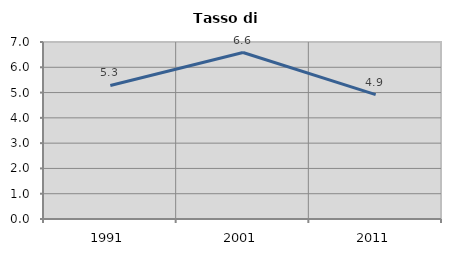
| Category | Tasso di disoccupazione   |
|---|---|
| 1991.0 | 5.281 |
| 2001.0 | 6.583 |
| 2011.0 | 4.918 |